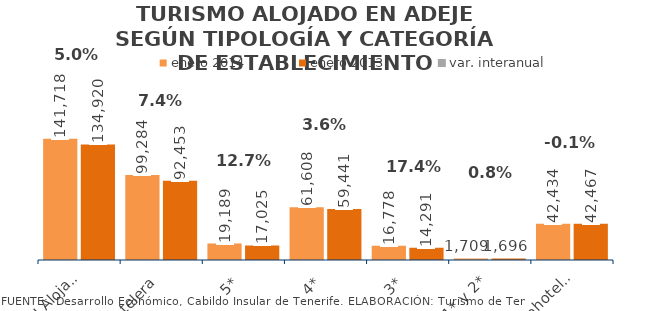
| Category | enero 2014 | enero 2013 |
|---|---|---|
| Total Alojados | 141718 | 134920 |
| Hotelera | 99284 | 92453 |
| 5* | 19189 | 17025 |
| 4* | 61608 | 59441 |
| 3* | 16778 | 14291 |
| 1* y 2* | 1709 | 1696 |
| Extrahotelera | 42434 | 42467 |